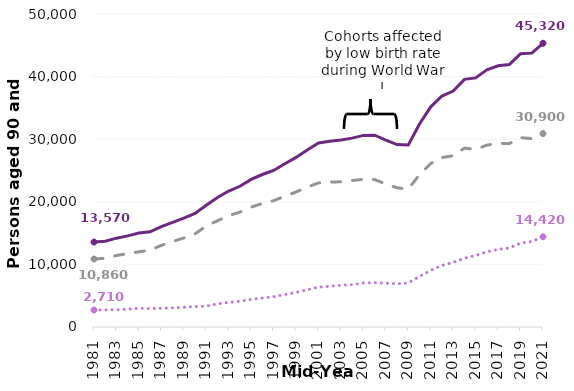
| Category | Persons | Females | Males |
|---|---|---|---|
| 1981.0 | 13570 | 10860 | 2710 |
| 1982.0 | 13710 | 10980 | 2730 |
| 1983.0 | 14190 | 11430 | 2760 |
| 1984.0 | 14560 | 11710 | 2850 |
| 1985.0 | 15000 | 12010 | 2990 |
| 1986.0 | 15210 | 12270 | 2940 |
| 1987.0 | 16030 | 13040 | 2990 |
| 1988.0 | 16700 | 13640 | 3060 |
| 1989.0 | 17380 | 14230 | 3150 |
| 1990.0 | 18150 | 14880 | 3270 |
| 1991.0 | 19460 | 16130 | 3330 |
| 1992.0 | 20680 | 16980 | 3700 |
| 1993.0 | 21720 | 17780 | 3940 |
| 1994.0 | 22480 | 18360 | 4120 |
| 1995.0 | 23570 | 19150 | 4420 |
| 1996.0 | 24360 | 19730 | 4630 |
| 1997.0 | 25010 | 20170 | 4840 |
| 1998.0 | 26090 | 20890 | 5200 |
| 1999.0 | 27090 | 21570 | 5520 |
| 2000.0 | 28290 | 22350 | 5940 |
| 2001.0 | 29390 | 23020 | 6370 |
| 2002.0 | 29670 | 23170 | 6500 |
| 2003.0 | 29860 | 23190 | 6670 |
| 2004.0 | 30170 | 23400 | 6770 |
| 2005.0 | 30610 | 23590 | 7020 |
| 2006.0 | 30640 | 23550 | 7090 |
| 2007.0 | 29850 | 22850 | 7000 |
| 2008.0 | 29140 | 22240 | 6900 |
| 2009.0 | 29070 | 22030 | 7040 |
| 2010.0 | 32440 | 24360 | 8080 |
| 2011.0 | 35170 | 26120 | 9050 |
| 2012.0 | 36900 | 27060 | 9840 |
| 2013.0 | 37690 | 27370 | 10320 |
| 2014.0 | 39560 | 28570 | 10990 |
| 2015.0 | 39790 | 28370 | 11420 |
| 2016.0 | 41070 | 29050 | 12020 |
| 2017.0 | 41730 | 29340 | 12390 |
| 2018.0 | 41930 | 29310 | 12620 |
| 2019.0 | 43660 | 30250 | 13410 |
| 2020.0 | 43750 | 30090 | 13660 |
| 2021.0 | 45320 | 30900 | 14420 |